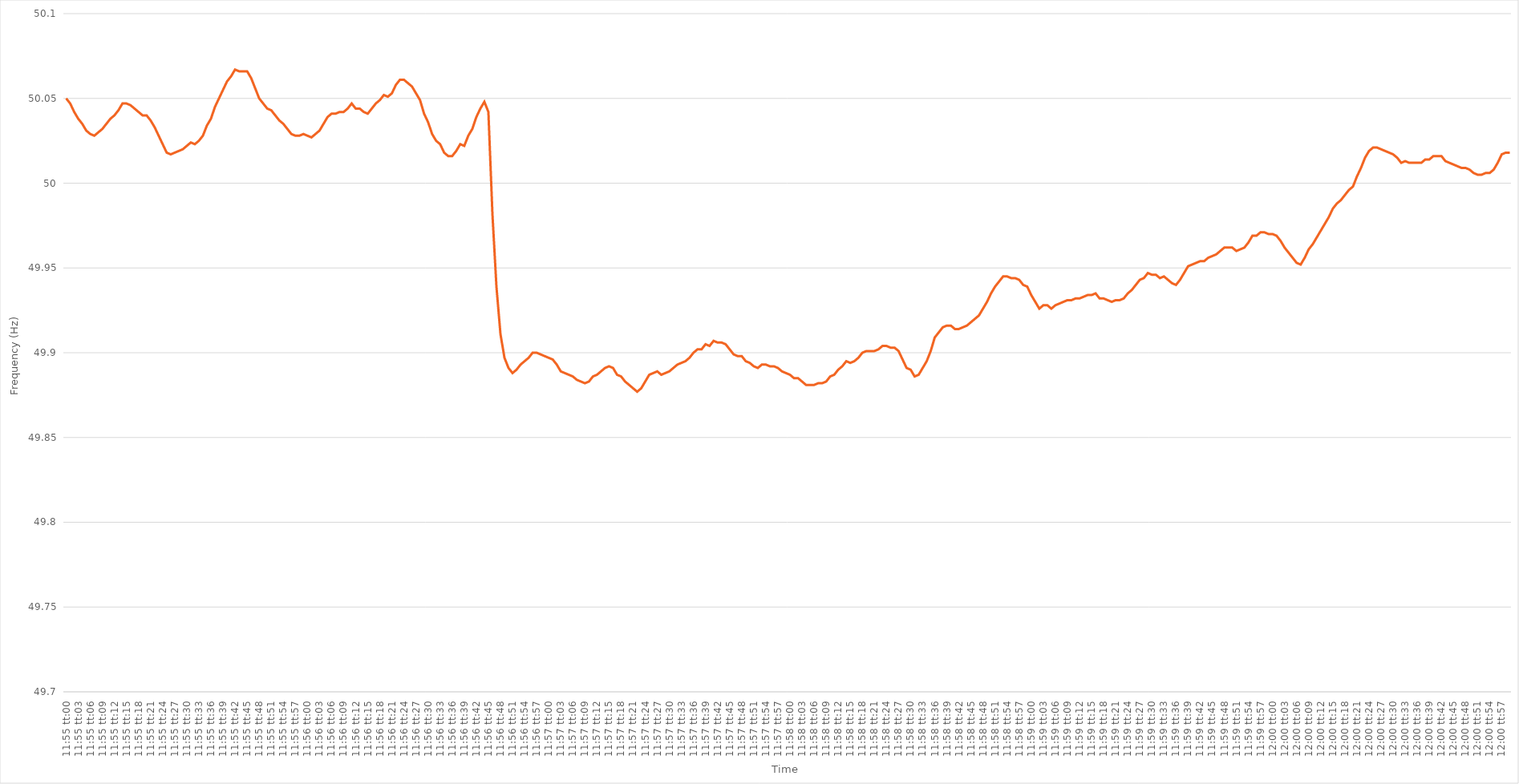
| Category | Series 0 |
|---|---|
| 0.49652777777777773 | 50.05 |
| 0.4965393518518519 | 50.047 |
| 0.4965509259259259 | 50.042 |
| 0.4965625 | 50.038 |
| 0.49657407407407406 | 50.035 |
| 0.49658564814814815 | 50.031 |
| 0.4965972222222222 | 50.029 |
| 0.49660879629629634 | 50.028 |
| 0.4966203703703704 | 50.03 |
| 0.4966319444444445 | 50.032 |
| 0.4966435185185185 | 50.035 |
| 0.4966550925925926 | 50.038 |
| 0.49666666666666665 | 50.04 |
| 0.4966782407407408 | 50.043 |
| 0.49668981481481483 | 50.047 |
| 0.4967013888888889 | 50.047 |
| 0.49671296296296297 | 50.046 |
| 0.496724537037037 | 50.044 |
| 0.4967361111111111 | 50.042 |
| 0.49674768518518514 | 50.04 |
| 0.4967592592592593 | 50.04 |
| 0.49677083333333333 | 50.037 |
| 0.4967824074074074 | 50.033 |
| 0.49679398148148146 | 50.028 |
| 0.49680555555555556 | 50.023 |
| 0.4968171296296296 | 50.018 |
| 0.49682870370370374 | 50.017 |
| 0.4968402777777778 | 50.018 |
| 0.4968518518518519 | 50.019 |
| 0.4968634259259259 | 50.02 |
| 0.496875 | 50.022 |
| 0.49688657407407405 | 50.024 |
| 0.4968981481481482 | 50.023 |
| 0.49690972222222224 | 50.025 |
| 0.49692129629629633 | 50.028 |
| 0.49693287037037037 | 50.034 |
| 0.4969444444444444 | 50.038 |
| 0.4969560185185185 | 50.045 |
| 0.49696759259259254 | 50.05 |
| 0.4969791666666667 | 50.055 |
| 0.49699074074074073 | 50.06 |
| 0.4970023148148148 | 50.063 |
| 0.49701388888888887 | 50.067 |
| 0.49702546296296296 | 50.066 |
| 0.497037037037037 | 50.066 |
| 0.49704861111111115 | 50.066 |
| 0.4970601851851852 | 50.062 |
| 0.4970717592592593 | 50.056 |
| 0.4970833333333333 | 50.05 |
| 0.4970949074074074 | 50.047 |
| 0.49710648148148145 | 50.044 |
| 0.4971180555555556 | 50.043 |
| 0.49712962962962964 | 50.04 |
| 0.49714120370370374 | 50.037 |
| 0.4971527777777778 | 50.035 |
| 0.4971643518518518 | 50.032 |
| 0.4971759259259259 | 50.029 |
| 0.49718749999999995 | 50.028 |
| 0.4971990740740741 | 50.028 |
| 0.49721064814814814 | 50.029 |
| 0.49722222222222223 | 50.028 |
| 0.49723379629629627 | 50.027 |
| 0.49724537037037037 | 50.029 |
| 0.4972569444444444 | 50.031 |
| 0.49726851851851855 | 50.035 |
| 0.4972800925925926 | 50.039 |
| 0.4972916666666667 | 50.041 |
| 0.4973032407407407 | 50.041 |
| 0.4973148148148148 | 50.042 |
| 0.49732638888888886 | 50.042 |
| 0.497337962962963 | 50.044 |
| 0.49734953703703705 | 50.047 |
| 0.49736111111111114 | 50.044 |
| 0.4973726851851852 | 50.044 |
| 0.4973842592592593 | 50.042 |
| 0.4973958333333333 | 50.041 |
| 0.49740740740740735 | 50.044 |
| 0.4974189814814815 | 50.047 |
| 0.49743055555555554 | 50.049 |
| 0.49744212962962964 | 50.052 |
| 0.4974537037037037 | 50.051 |
| 0.49746527777777777 | 50.053 |
| 0.4974768518518518 | 50.058 |
| 0.49748842592592596 | 50.061 |
| 0.4975 | 50.061 |
| 0.4975115740740741 | 50.059 |
| 0.49752314814814813 | 50.057 |
| 0.4975347222222222 | 50.053 |
| 0.49754629629629626 | 50.049 |
| 0.4975578703703704 | 50.041 |
| 0.49756944444444445 | 50.036 |
| 0.49758101851851855 | 50.029 |
| 0.4975925925925926 | 50.025 |
| 0.4976041666666667 | 50.023 |
| 0.4976157407407407 | 50.018 |
| 0.49762731481481487 | 50.016 |
| 0.4976388888888889 | 50.016 |
| 0.49765046296296295 | 50.019 |
| 0.49766203703703704 | 50.023 |
| 0.4976736111111111 | 50.022 |
| 0.4976851851851852 | 50.028 |
| 0.4976967592592592 | 50.032 |
| 0.49770833333333336 | 50.039 |
| 0.4977199074074074 | 50.044 |
| 0.4977314814814815 | 50.048 |
| 0.49774305555555554 | 50.042 |
| 0.49775462962962963 | 49.982 |
| 0.49776620370370367 | 49.939 |
| 0.4977777777777778 | 49.911 |
| 0.49778935185185186 | 49.897 |
| 0.49780092592592595 | 49.891 |
| 0.4978125 | 49.888 |
| 0.4978240740740741 | 49.89 |
| 0.4978356481481481 | 49.893 |
| 0.4978472222222223 | 49.895 |
| 0.4978587962962963 | 49.897 |
| 0.49787037037037035 | 49.9 |
| 0.49788194444444445 | 49.9 |
| 0.4978935185185185 | 49.899 |
| 0.4979050925925926 | 49.898 |
| 0.4979166666666666 | 49.897 |
| 0.49792824074074077 | 49.896 |
| 0.4979398148148148 | 49.893 |
| 0.4979513888888889 | 49.889 |
| 0.49796296296296294 | 49.888 |
| 0.49797453703703703 | 49.887 |
| 0.4979861111111111 | 49.886 |
| 0.4979976851851852 | 49.884 |
| 0.49800925925925926 | 49.883 |
| 0.49802083333333336 | 49.882 |
| 0.4980324074074074 | 49.883 |
| 0.4980439814814815 | 49.886 |
| 0.49805555555555553 | 49.887 |
| 0.4980671296296297 | 49.889 |
| 0.4980787037037037 | 49.891 |
| 0.4980902777777778 | 49.892 |
| 0.49810185185185185 | 49.891 |
| 0.4981134259259259 | 49.887 |
| 0.498125 | 49.886 |
| 0.498136574074074 | 49.883 |
| 0.4981481481481482 | 49.881 |
| 0.4981597222222222 | 49.879 |
| 0.4981712962962963 | 49.877 |
| 0.49818287037037035 | 49.879 |
| 0.49819444444444444 | 49.883 |
| 0.4982060185185185 | 49.887 |
| 0.49821759259259263 | 49.888 |
| 0.49822916666666667 | 49.889 |
| 0.49824074074074076 | 49.887 |
| 0.4982523148148148 | 49.888 |
| 0.4982638888888889 | 49.889 |
| 0.49827546296296293 | 49.891 |
| 0.4982870370370371 | 49.893 |
| 0.4982986111111111 | 49.894 |
| 0.4983101851851852 | 49.895 |
| 0.49832175925925926 | 49.897 |
| 0.49833333333333335 | 49.9 |
| 0.4983449074074074 | 49.902 |
| 0.49835648148148143 | 49.902 |
| 0.4983680555555556 | 49.905 |
| 0.4983796296296296 | 49.904 |
| 0.4983912037037037 | 49.907 |
| 0.49840277777777775 | 49.906 |
| 0.49841435185185184 | 49.906 |
| 0.4984259259259259 | 49.905 |
| 0.49843750000000003 | 49.902 |
| 0.49844907407407407 | 49.899 |
| 0.49846064814814817 | 49.898 |
| 0.4984722222222222 | 49.898 |
| 0.4984837962962963 | 49.895 |
| 0.49849537037037034 | 49.894 |
| 0.4985069444444445 | 49.892 |
| 0.4985185185185185 | 49.891 |
| 0.4985300925925926 | 49.893 |
| 0.49854166666666666 | 49.893 |
| 0.49855324074074076 | 49.892 |
| 0.4985648148148148 | 49.892 |
| 0.49857638888888894 | 49.891 |
| 0.498587962962963 | 49.889 |
| 0.498599537037037 | 49.888 |
| 0.4986111111111111 | 49.887 |
| 0.49862268518518515 | 49.885 |
| 0.49863425925925925 | 49.885 |
| 0.4986458333333333 | 49.883 |
| 0.49865740740740744 | 49.881 |
| 0.4986689814814815 | 49.881 |
| 0.49868055555555557 | 49.881 |
| 0.4986921296296296 | 49.882 |
| 0.4987037037037037 | 49.882 |
| 0.49871527777777774 | 49.883 |
| 0.4987268518518519 | 49.886 |
| 0.49873842592592593 | 49.887 |
| 0.49875 | 49.89 |
| 0.49876157407407407 | 49.892 |
| 0.49877314814814816 | 49.895 |
| 0.4987847222222222 | 49.894 |
| 0.49879629629629635 | 49.895 |
| 0.4988078703703704 | 49.897 |
| 0.4988194444444444 | 49.9 |
| 0.4988310185185185 | 49.901 |
| 0.49884259259259256 | 49.901 |
| 0.49885416666666665 | 49.901 |
| 0.4988657407407407 | 49.902 |
| 0.49887731481481484 | 49.904 |
| 0.4988888888888889 | 49.904 |
| 0.498900462962963 | 49.903 |
| 0.498912037037037 | 49.903 |
| 0.4989236111111111 | 49.901 |
| 0.49893518518518515 | 49.896 |
| 0.4989467592592593 | 49.891 |
| 0.49895833333333334 | 49.89 |
| 0.49896990740740743 | 49.886 |
| 0.49898148148148147 | 49.887 |
| 0.49899305555555556 | 49.891 |
| 0.4990046296296296 | 49.895 |
| 0.49901620370370375 | 49.901 |
| 0.4990277777777778 | 49.909 |
| 0.4990393518518519 | 49.912 |
| 0.4990509259259259 | 49.915 |
| 0.49906249999999996 | 49.916 |
| 0.49907407407407406 | 49.916 |
| 0.4990856481481481 | 49.914 |
| 0.49909722222222225 | 49.914 |
| 0.4991087962962963 | 49.915 |
| 0.4991203703703704 | 49.916 |
| 0.4991319444444444 | 49.918 |
| 0.4991435185185185 | 49.92 |
| 0.49915509259259255 | 49.922 |
| 0.4991666666666667 | 49.926 |
| 0.49917824074074074 | 49.93 |
| 0.49918981481481484 | 49.935 |
| 0.4992013888888889 | 49.939 |
| 0.49921296296296297 | 49.942 |
| 0.499224537037037 | 49.945 |
| 0.49923611111111116 | 49.945 |
| 0.4992476851851852 | 49.944 |
| 0.4992592592592593 | 49.944 |
| 0.49927083333333333 | 49.943 |
| 0.4992824074074074 | 49.94 |
| 0.49929398148148146 | 49.939 |
| 0.4993055555555555 | 49.934 |
| 0.49931712962962965 | 49.93 |
| 0.4993287037037037 | 49.926 |
| 0.4993402777777778 | 49.928 |
| 0.4993518518518518 | 49.928 |
| 0.4993634259259259 | 49.926 |
| 0.49937499999999996 | 49.928 |
| 0.4993865740740741 | 49.929 |
| 0.49939814814814815 | 49.93 |
| 0.49940972222222224 | 49.931 |
| 0.4994212962962963 | 49.931 |
| 0.4994328703703704 | 49.932 |
| 0.4994444444444444 | 49.932 |
| 0.49945601851851856 | 49.933 |
| 0.4994675925925926 | 49.934 |
| 0.4994791666666667 | 49.934 |
| 0.49949074074074074 | 49.935 |
| 0.49950231481481483 | 49.932 |
| 0.49951388888888887 | 49.932 |
| 0.499525462962963 | 49.931 |
| 0.49953703703703706 | 49.93 |
| 0.4995486111111111 | 49.931 |
| 0.4995601851851852 | 49.931 |
| 0.49957175925925923 | 49.932 |
| 0.4995833333333333 | 49.935 |
| 0.49959490740740736 | 49.937 |
| 0.4996064814814815 | 49.94 |
| 0.49961805555555555 | 49.943 |
| 0.49962962962962965 | 49.944 |
| 0.4996412037037037 | 49.947 |
| 0.4996527777777778 | 49.946 |
| 0.4996643518518518 | 49.946 |
| 0.49967592592592597 | 49.944 |
| 0.4996875 | 49.945 |
| 0.4996990740740741 | 49.943 |
| 0.49971064814814814 | 49.941 |
| 0.49972222222222223 | 49.94 |
| 0.4997337962962963 | 49.943 |
| 0.4997453703703704 | 49.947 |
| 0.49975694444444446 | 49.951 |
| 0.4997685185185185 | 49.952 |
| 0.4997800925925926 | 49.953 |
| 0.49979166666666663 | 49.954 |
| 0.49980324074074073 | 49.954 |
| 0.49981481481481477 | 49.956 |
| 0.4998263888888889 | 49.957 |
| 0.49983796296296296 | 49.958 |
| 0.49984953703703705 | 49.96 |
| 0.4998611111111111 | 49.962 |
| 0.4998726851851852 | 49.962 |
| 0.4998842592592592 | 49.962 |
| 0.4998958333333334 | 49.96 |
| 0.4999074074074074 | 49.961 |
| 0.4999189814814815 | 49.962 |
| 0.49993055555555554 | 49.965 |
| 0.49994212962962964 | 49.969 |
| 0.4999537037037037 | 49.969 |
| 0.49996527777777783 | 49.971 |
| 0.49997685185185187 | 49.971 |
| 0.49998842592592596 | 49.97 |
| 0.5 | 49.97 |
| 0.500011574074074 | 49.969 |
| 0.5000231481481482 | 49.966 |
| 0.5000347222222222 | 49.962 |
| 0.5000462962962963 | 49.959 |
| 0.5000578703703703 | 49.956 |
| 0.5000694444444445 | 49.953 |
| 0.5000810185185185 | 49.952 |
| 0.5000925925925926 | 49.956 |
| 0.5001041666666667 | 49.961 |
| 0.5001157407407407 | 49.964 |
| 0.5001273148148148 | 49.968 |
| 0.5001388888888889 | 49.972 |
| 0.500150462962963 | 49.976 |
| 0.5001620370370371 | 49.98 |
| 0.5001736111111111 | 49.985 |
| 0.5001851851851852 | 49.988 |
| 0.5001967592592592 | 49.99 |
| 0.5002083333333334 | 49.993 |
| 0.5002199074074074 | 49.996 |
| 0.5002314814814816 | 49.998 |
| 0.5002430555555556 | 50.004 |
| 0.5002546296296296 | 50.009 |
| 0.5002662037037037 | 50.015 |
| 0.5002777777777777 | 50.019 |
| 0.5002893518518519 | 50.021 |
| 0.5003009259259259 | 50.021 |
| 0.5003125 | 50.02 |
| 0.5003240740740741 | 50.019 |
| 0.5003356481481481 | 50.018 |
| 0.5003472222222222 | 50.017 |
| 0.5003587962962963 | 50.015 |
| 0.5003703703703704 | 50.012 |
| 0.5003819444444445 | 50.013 |
| 0.5003935185185185 | 50.012 |
| 0.5004050925925926 | 50.012 |
| 0.5004166666666666 | 50.012 |
| 0.5004282407407408 | 50.012 |
| 0.5004398148148148 | 50.014 |
| 0.500451388888889 | 50.014 |
| 0.500462962962963 | 50.016 |
| 0.500474537037037 | 50.016 |
| 0.5004861111111111 | 50.016 |
| 0.5004976851851851 | 50.013 |
| 0.5005092592592593 | 50.012 |
| 0.5005208333333333 | 50.011 |
| 0.5005324074074075 | 50.01 |
| 0.5005439814814815 | 50.009 |
| 0.5005555555555555 | 50.009 |
| 0.5005671296296296 | 50.008 |
| 0.5005787037037037 | 50.006 |
| 0.5005902777777778 | 50.005 |
| 0.5006018518518519 | 50.005 |
| 0.500613425925926 | 50.006 |
| 0.500625 | 50.006 |
| 0.500636574074074 | 50.008 |
| 0.5006481481481482 | 50.012 |
| 0.5006597222222222 | 50.017 |
| 0.5006712962962964 | 50.018 |
| 0.5006828703703704 | 50.018 |